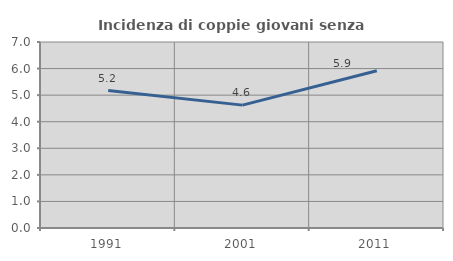
| Category | Incidenza di coppie giovani senza figli |
|---|---|
| 1991.0 | 5.172 |
| 2001.0 | 4.624 |
| 2011.0 | 5.917 |